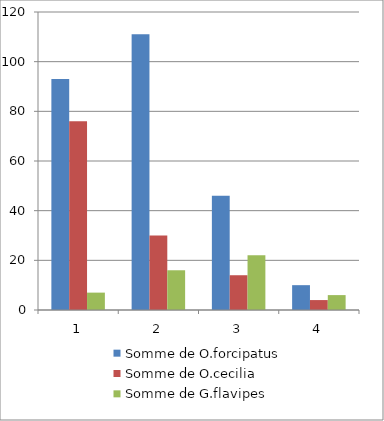
| Category | Somme de O.forcipatus | Somme de O.cecilia | Somme de G.flavipes |
|---|---|---|---|
| 1 | 93 | 76 | 7 |
| 2 | 111 | 30 | 16 |
| 3 | 46 | 14 | 22 |
| 4 | 10 | 4 | 6 |